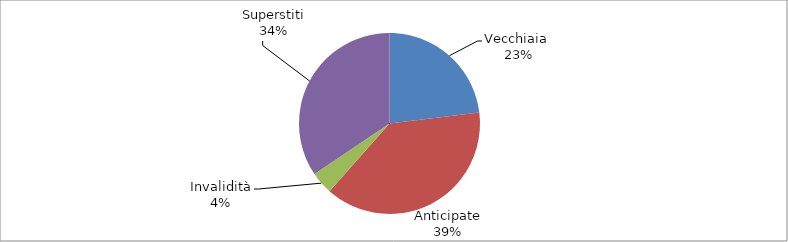
| Category | Series 0 |
|---|---|
| Vecchiaia  | 5070 |
| Anticipate | 8469 |
| Invalidità | 886 |
| Superstiti | 7576 |